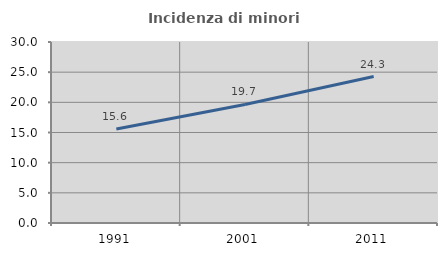
| Category | Incidenza di minori stranieri |
|---|---|
| 1991.0 | 15.591 |
| 2001.0 | 19.653 |
| 2011.0 | 24.272 |